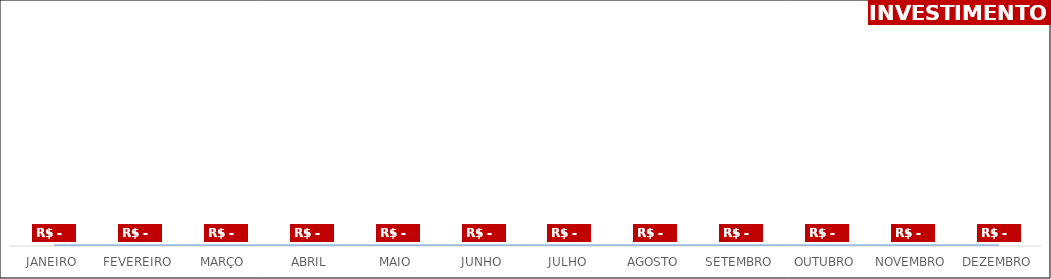
| Category | Series 0 |
|---|---|
| JANEIRO | 0 |
| FEVEREIRO | 0 |
| MARÇO | 0 |
| ABRIL | 0 |
| MAIO | 0 |
| JUNHO | 0 |
| JULHO | 0 |
| AGOSTO | 0 |
| SETEMBRO | 0 |
| OUTUBRO | 0 |
| NOVEMBRO | 0 |
| DEZEMBRO | 0 |